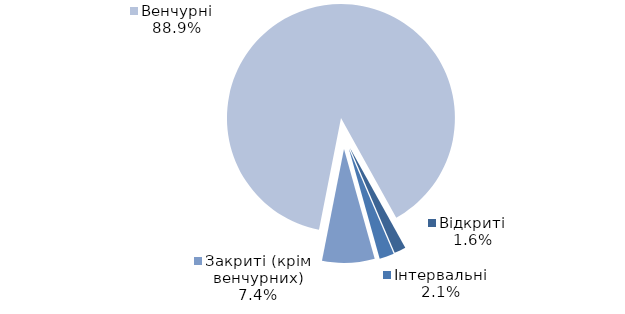
| Category | Series 0 |
|---|---|
| Відкриті | 19 |
| Інтервальні | 24 |
| Закриті (крім венчурних) | 86 |
| Венчурні | 1028 |